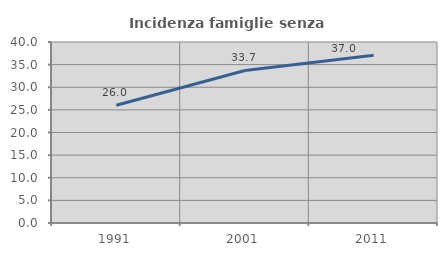
| Category | Incidenza famiglie senza nuclei |
|---|---|
| 1991.0 | 26.028 |
| 2001.0 | 33.716 |
| 2011.0 | 37.049 |